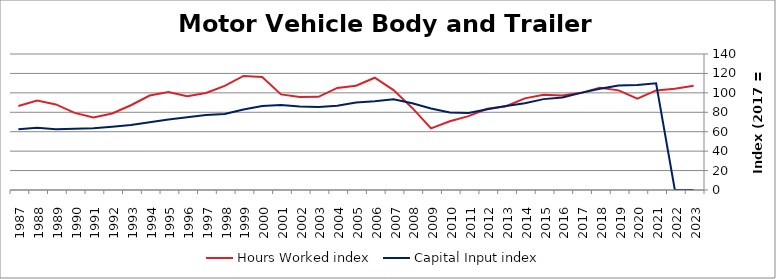
| Category | Hours Worked index | Capital Input index |
|---|---|---|
| 2023.0 | 107.421 | 0 |
| 2022.0 | 104.305 | 0 |
| 2021.0 | 102.527 | 109.84 |
| 2020.0 | 93.982 | 108.051 |
| 2019.0 | 102.547 | 107.573 |
| 2018.0 | 105.172 | 104.195 |
| 2017.0 | 100 | 100 |
| 2016.0 | 97.297 | 95.301 |
| 2015.0 | 98.023 | 93.55 |
| 2014.0 | 94.316 | 89.364 |
| 2013.0 | 86.214 | 86.421 |
| 2012.0 | 83.56 | 83.072 |
| 2011.0 | 76.016 | 79.349 |
| 2010.0 | 70.737 | 79.71 |
| 2009.0 | 63.423 | 83.867 |
| 2008.0 | 84.498 | 89.204 |
| 2007.0 | 102.842 | 93.385 |
| 2006.0 | 115.583 | 91.466 |
| 2005.0 | 107.316 | 90.02 |
| 2004.0 | 105.046 | 86.805 |
| 2003.0 | 95.935 | 85.534 |
| 2002.0 | 95.681 | 85.952 |
| 2001.0 | 98.412 | 87.41 |
| 2000.0 | 116.309 | 86.459 |
| 1999.0 | 117.412 | 82.889 |
| 1998.0 | 107.235 | 78.337 |
| 1997.0 | 99.909 | 77.133 |
| 1996.0 | 96.447 | 74.904 |
| 1995.0 | 100.86 | 72.499 |
| 1994.0 | 97.264 | 69.775 |
| 1993.0 | 87.237 | 66.907 |
| 1992.0 | 78.746 | 65.094 |
| 1991.0 | 74.683 | 63.585 |
| 1990.0 | 79.355 | 62.996 |
| 1989.0 | 88.103 | 62.592 |
| 1988.0 | 91.993 | 64.025 |
| 1987.0 | 86.541 | 62.606 |